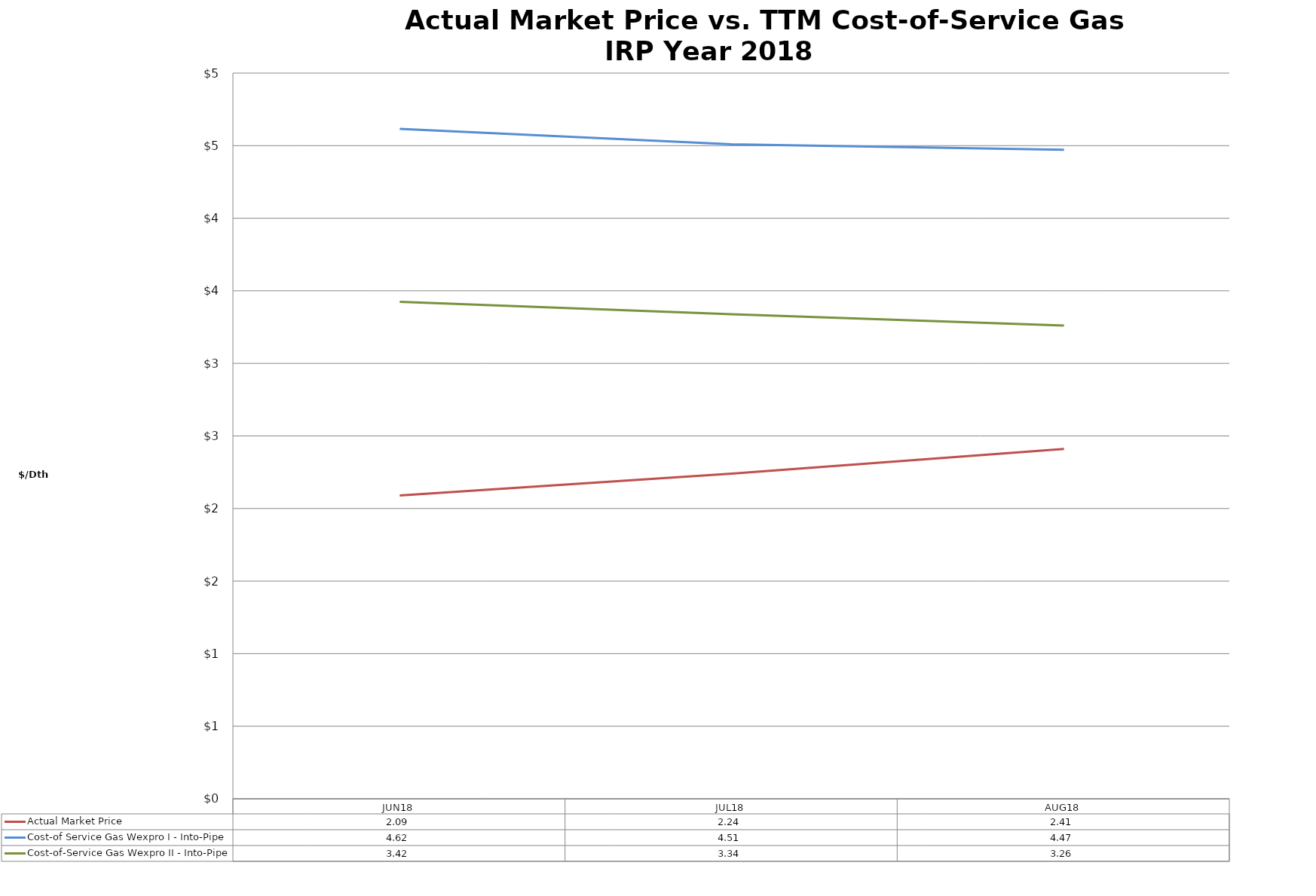
| Category | Actual Market Price | Cost-of Service Gas Wexpro I - Into-Pipe | Cost-of-Service Gas Wexpro II - Into-Pipe |
|---|---|---|---|
| JUN18 | 2.09 | 4.616 | 3.425 |
| JUL18 | 2.24 | 4.509 | 3.338 |
| AUG18 | 2.41 | 4.472 | 3.261 |